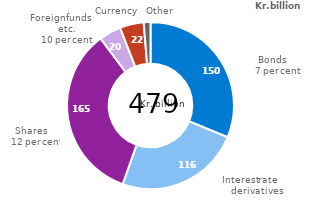
| Category | serie1 |
|---|---|
| Bonds | 149.52 |
| Interest rate derivatives | 116.01 |
| Shares | 164.79 |
| Foreign funds etc. | 20.38 |
| Currency | 22.2 |
| Other | 6.25 |